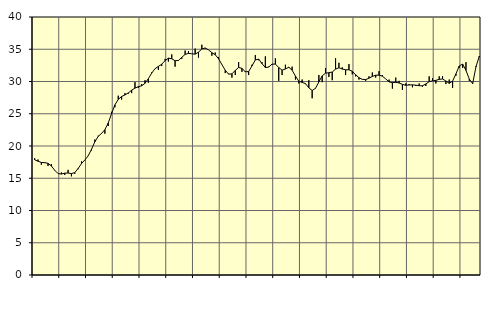
| Category | Piggar | Series 1 |
|---|---|---|
| nan | 18.1 | 17.86 |
| 87.0 | 17.9 | 17.64 |
| 87.0 | 17.1 | 17.45 |
| 87.0 | 17.5 | 17.41 |
| nan | 16.9 | 17.32 |
| 88.0 | 17.2 | 16.9 |
| 88.0 | 16.2 | 16.24 |
| 88.0 | 15.7 | 15.72 |
| nan | 15.9 | 15.65 |
| 89.0 | 15.5 | 15.79 |
| 89.0 | 16.3 | 15.81 |
| 89.0 | 15.3 | 15.72 |
| nan | 15.7 | 15.88 |
| 90.0 | 16.4 | 16.51 |
| 90.0 | 17.6 | 17.27 |
| 90.0 | 17.8 | 17.83 |
| nan | 18.5 | 18.47 |
| 91.0 | 19.3 | 19.49 |
| 91.0 | 21 | 20.65 |
| 91.0 | 21.6 | 21.49 |
| nan | 21.9 | 21.95 |
| 92.0 | 21.9 | 22.53 |
| 92.0 | 23.1 | 23.57 |
| 92.0 | 25.3 | 25.01 |
| nan | 26 | 26.38 |
| 93.0 | 27.8 | 27.22 |
| 93.0 | 27.2 | 27.68 |
| 93.0 | 28.2 | 27.91 |
| nan | 28.1 | 28.23 |
| 94.0 | 28.2 | 28.65 |
| 94.0 | 29.9 | 28.98 |
| 94.0 | 29 | 29.2 |
| nan | 29.6 | 29.33 |
| 95.0 | 30.2 | 29.72 |
| 95.0 | 29.8 | 30.42 |
| 95.0 | 31.4 | 31.3 |
| nan | 32 | 31.98 |
| 96.0 | 31.8 | 32.34 |
| 96.0 | 32.4 | 32.68 |
| 96.0 | 33.5 | 33.22 |
| nan | 33.1 | 33.62 |
| 97.0 | 34.2 | 33.52 |
| 97.0 | 32.3 | 33.22 |
| 97.0 | 33.3 | 33.26 |
| nan | 33.5 | 33.74 |
| 98.0 | 34.8 | 34.2 |
| 98.0 | 34.7 | 34.36 |
| 98.0 | 34.3 | 34.3 |
| nan | 35.1 | 34.24 |
| 99.0 | 33.7 | 34.55 |
| 99.0 | 35.7 | 35.04 |
| 99.0 | 35.1 | 35.2 |
| nan | 34.9 | 34.9 |
| 0.0 | 34 | 34.47 |
| 0.0 | 34.5 | 34.15 |
| 0.0 | 33.8 | 33.52 |
| nan | 32.6 | 32.63 |
| 1.0 | 31.3 | 31.75 |
| 1.0 | 31.2 | 31.14 |
| 1.0 | 30.6 | 31.18 |
| nan | 31 | 31.72 |
| 2.0 | 33 | 32.18 |
| 2.0 | 31.5 | 32.04 |
| 2.0 | 31.6 | 31.5 |
| nan | 31 | 31.54 |
| 3.0 | 32.6 | 32.41 |
| 3.0 | 34.1 | 33.35 |
| 3.0 | 33.3 | 33.47 |
| nan | 33 | 32.77 |
| 4.0 | 33.9 | 32.16 |
| 4.0 | 32.3 | 32.24 |
| 4.0 | 32.6 | 32.69 |
| nan | 33.6 | 32.7 |
| 5.0 | 30.1 | 32.17 |
| 5.0 | 31 | 31.75 |
| 5.0 | 32.6 | 31.94 |
| nan | 32.1 | 32.21 |
| 6.0 | 32.3 | 31.76 |
| 6.0 | 30.3 | 30.84 |
| 6.0 | 29.7 | 30.05 |
| nan | 30.3 | 29.86 |
| 7.0 | 29.6 | 29.67 |
| 7.0 | 30.2 | 29.02 |
| 7.0 | 27.4 | 28.61 |
| nan | 28.9 | 28.94 |
| 8.0 | 31 | 29.94 |
| 8.0 | 29.9 | 30.87 |
| 8.0 | 32.1 | 31.3 |
| nan | 30.7 | 31.36 |
| 9.0 | 30.2 | 31.47 |
| 9.0 | 33.6 | 31.92 |
| 9.0 | 32.9 | 32.13 |
| nan | 32.2 | 31.93 |
| 10.0 | 31 | 31.81 |
| 10.0 | 32.7 | 31.82 |
| 10.0 | 31.1 | 31.59 |
| nan | 30.8 | 31.04 |
| 11.0 | 30.3 | 30.59 |
| 11.0 | 30.3 | 30.33 |
| 11.0 | 30.1 | 30.29 |
| nan | 30.8 | 30.52 |
| 12.0 | 31.4 | 30.78 |
| 12.0 | 30.6 | 30.98 |
| 12.0 | 31.6 | 30.98 |
| nan | 31 | 30.83 |
| 13.0 | 30.4 | 30.41 |
| 13.0 | 30.3 | 29.93 |
| 13.0 | 28.9 | 29.83 |
| nan | 30.6 | 29.87 |
| 14.0 | 30.1 | 29.77 |
| 14.0 | 28.7 | 29.55 |
| 14.0 | 29.7 | 29.41 |
| nan | 29.6 | 29.46 |
| 15.0 | 29.1 | 29.48 |
| 15.0 | 29.3 | 29.43 |
| 15.0 | 29.7 | 29.35 |
| nan | 29.2 | 29.34 |
| 16.0 | 29.3 | 29.62 |
| 16.0 | 30.8 | 29.97 |
| 16.0 | 30.5 | 30.1 |
| nan | 29.7 | 30.18 |
| 17.0 | 30.8 | 30.33 |
| 17.0 | 30.8 | 30.39 |
| 17.0 | 29.6 | 30.08 |
| nan | 30.3 | 29.71 |
| 18.0 | 29 | 30.06 |
| 18.0 | 30.9 | 31.18 |
| 18.0 | 32.1 | 32.41 |
| nan | 32.1 | 32.7 |
| 19.0 | 33 | 31.72 |
| 19.0 | 30.1 | 30.38 |
| 19.0 | 29.8 | 29.66 |
| nan | 32.4 | 32.29 |
| 20.0 | 33.8 | 33.95 |